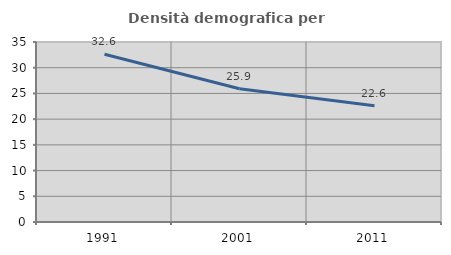
| Category | Densità demografica |
|---|---|
| 1991.0 | 32.615 |
| 2001.0 | 25.903 |
| 2011.0 | 22.62 |